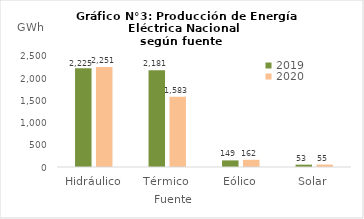
| Category | 2019 | 2020 |
|---|---|---|
| Hidráulico | 2225.359 | 2250.568 |
| Térmico | 2180.772 | 1583.349 |
| Eólico | 148.609 | 161.987 |
| Solar | 52.893 | 55.071 |